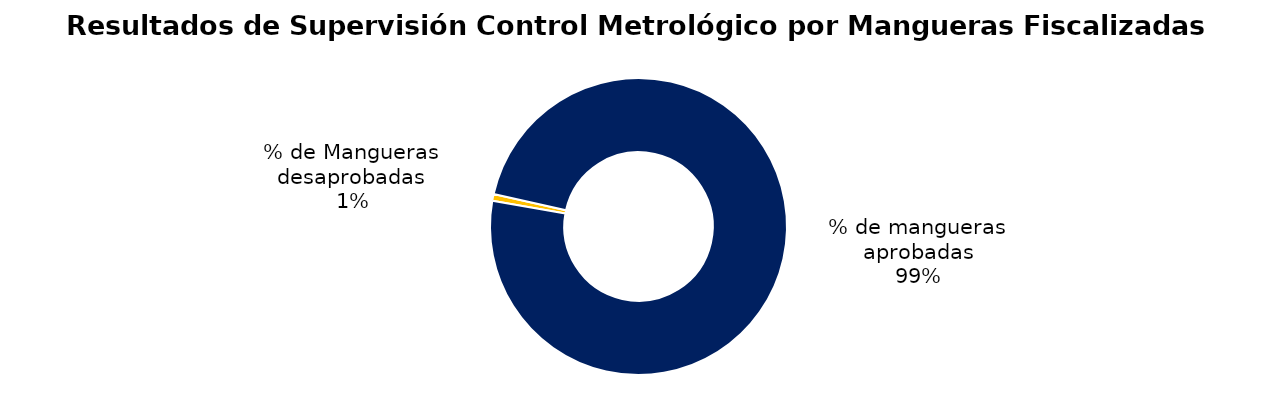
| Category | Series 0 |
|---|---|
| % de Mangueras desaprobadas | 40 |
| % de mangueras aprobadas | 5460 |